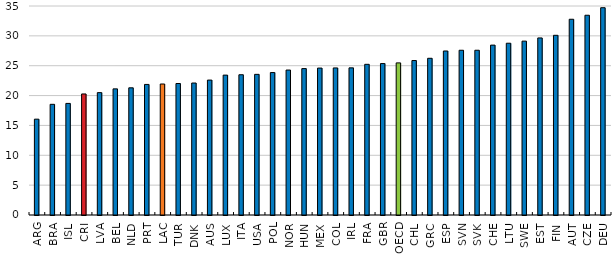
| Category | Series 0 |
|---|---|
| ARG | 16.048 |
| BRA | 18.534 |
| ISL | 18.687 |
| CRI | 20.27 |
| LVA | 20.491 |
| BEL | 21.121 |
| NLD | 21.297 |
| PRT | 21.867 |
| LAC | 21.936 |
| TUR | 22.021 |
| DNK | 22.103 |
| AUS | 22.594 |
| LUX | 23.426 |
| ITA | 23.488 |
| USA | 23.555 |
| POL | 23.853 |
| NOR | 24.276 |
| HUN | 24.516 |
| MEX | 24.606 |
| COL | 24.629 |
| IRL | 24.639 |
| FRA | 25.232 |
| GBR | 25.36 |
| OECD | 25.474 |
| CHL | 25.866 |
| GRC | 26.244 |
| ESP | 27.467 |
| SVN | 27.588 |
| SVK | 27.59 |
| CHE | 28.449 |
| LTU | 28.765 |
| SWE | 29.116 |
| EST | 29.652 |
| FIN | 30.093 |
| AUT | 32.781 |
| CZE | 33.451 |
| DEU | 34.713 |